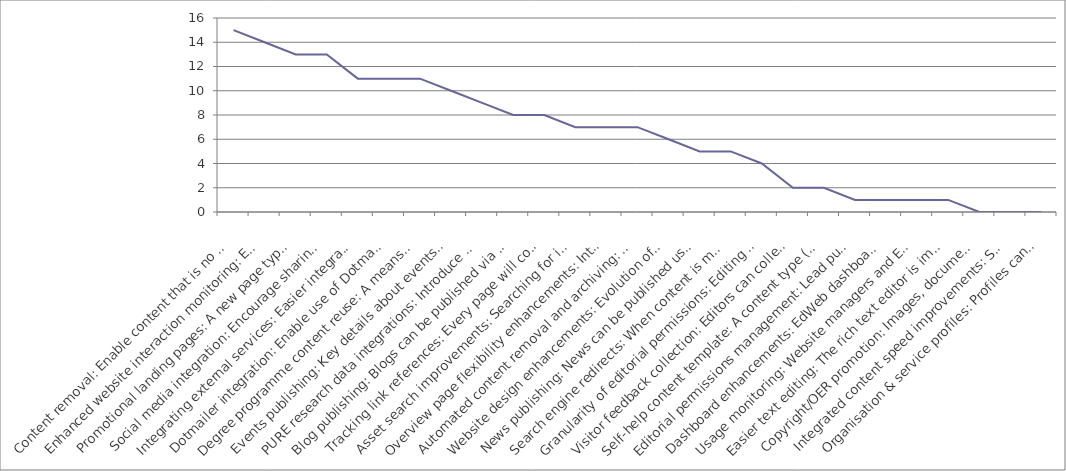
| Category | Series 0 |
|---|---|
| Content removal: Enable content that is no longer required or created in error to be removable, reducing unnecessary clutter in the EdWeb content tree for editors. | 15 |
| Enhanced website interaction monitoring: Enable use of analytics tools (click heat tracking, A/B testing etc) that provide additional insight into how website visitors are interacting with the website. This informs ongoing content & design improvements. | 14 |
| Promotional landing pages: A new page type designed for promotional impact and flexibility, which can be used at any point in a site structure. It will work much like a Generic Content page, but have presentational features similar to a homepage. | 13 |
| Social media integration: Encourage sharing of website content via social media buttons, and features to monitor engagement on popular networks. | 13 |
| Integrating external services: Easier integration of services such as Google Maps, You Tube videos, Twitter feeds. Simple URL pasting into EdWeb with no need for interaction with HTML or assets. | 11 |
| Dotmailer integration: Enable use of Dotmailer through EdWeb as a means to build and manage mailing lists more efficiently. | 11 |
| Degree programme content reuse: A means to re-use and extend golden copy content about degree programmes, that is currently published only via the Degree Finder | 11 |
| Events publishing: Key details about events can be displayed differently in different contexts, such as the automatic creation of an events calendar. | 10 |
| PURE research data integrations: Introduce more opportunities to present information from the Edinburgh Research Explorer in EdWeb-managed web pages, with no technical knowledge needed. (Currently only publication lists possible). | 9 |
| Blog publishing: Blogs can be published via EdWeb, with sufficient design changes to distinguish from corporate web content, and new navigation and filtering options typically associated with this kind of content (sort by author, by date, by tag etc). | 8 |
| Tracking link references: Every page will contain a list of all other EdWeb pages that link to it, so that when it is edited, moved or removed the editor is aware of the impact of their actions on other publishers across the University. | 8 |
| Asset search improvements: Searching for images, documents, videos, content snippets etc is quicker, easier and more efficient. | 7 |
| Overview page flexibility enhancements: Introduce new layout options to enable overview pages to dynamically present the content below in a range of ways. | 7 |
| Automated content removal and archiving: Schedule archiving and permanent removal of unpublished content after given periods to reduce unnecessary clutter and support compliance with records management legislation. | 7 |
| Website design enhancements: Evolution of design to improve website visitor experience on small devices, bringing greater focus to content over brand & navigation elements and promoting clearer/easier interactions. | 6 |
| News publishing: News can be published using a dedicated content type (template); enhancing presentation on different device sizes, allowing more intelligent sharing and promotion in search results. | 5 |
| Search engine redirects: When content is moved or removed, enable 301 redirects. This reduces the risk of a website visitor receiving a 'Page not found' error from a search result in the period before the site is re-indexed. | 5 |
| Granularity of editorial permissions: Editing rights can be restricted to particular subsections or content types, rather than having access to everything in a particular site. | 4 |
| Visitor feedback collection: Editors can collect and view visitor ratings for page content, to identify strengths and quickly correct any errors. | 2 |
| Self-help content template: A content type (template) optimised for presentation of online help and guidance, supporting user self service. | 2 |
| Editorial permissions management: Lead publishers can assign editorial rights on their website to any trained user, without involving EdWeb support. | 1 |
| Dashboard enhancements: EdWeb dashboard is more useful to editors and publishers, speeding up completion of the most common tasks, and can be configured to suit an individual's priorities. | 1 |
| Usage monitoring: Website managers and EdWeb support services have access to data on editorial and publishing activity, which will support better website management, staffing and user support-related decision making. | 1 |
| Easier text editing: The rich text editor is improved, so that it's quicker and easier to make changes to content, to apply stand-out formatting elements and to ensure everything is standards compliant. | 1 |
| Copyright/OER promotion: Images, documents and other assets can be promoted as Open Educational Resources, encouraging reuse of University materials worldwide. | 0 |
| Integrated content speed improvements: Speed up page load times for content being delivered from external systems through EdWeb. | 0 |
| Organisation & service profiles: Profiles can be published using a dedicated content type (template); enhancing presentation on different device sizes, allowing more intelligent sharing and promotion in search results. | 0 |